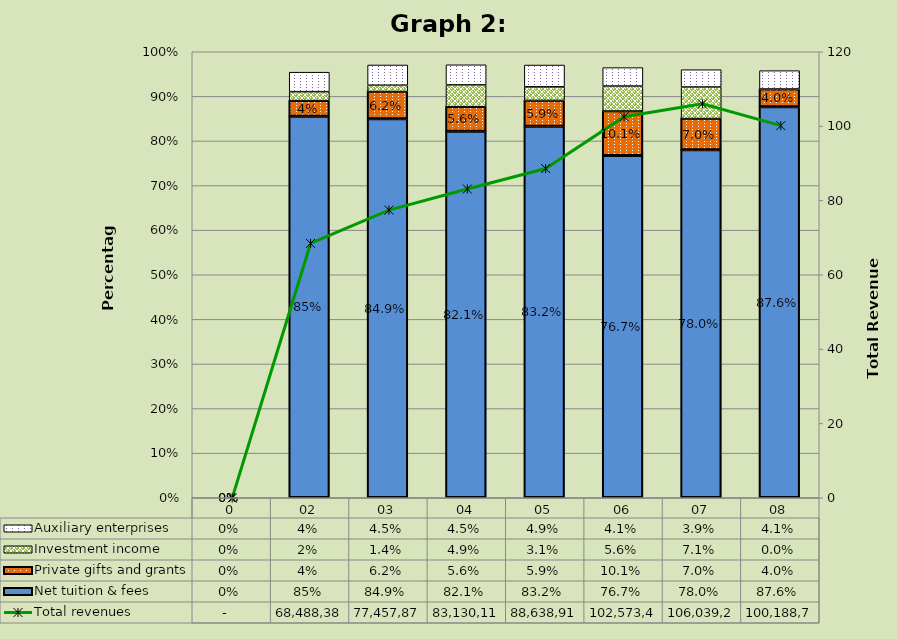
| Category | Net tuition & fees | Private gifts and grants | Investment income | Auxiliary enterprises |
|---|---|---|---|---|
| 0 | 0 | 0 | 0 | 0 |
| 02 | 0.855 | 0.036 | 0.02 | 0.044 |
| 03 | 0.849 | 0.062 | 0.014 | 0.045 |
| 04 | 0.821 | 0.056 | 0.049 | 0.045 |
| 05 | 0.832 | 0.059 | 0.031 | 0.049 |
| 06 | 0.767 | 0.101 | 0.056 | 0.041 |
| 07 | 0.78 | 0.07 | 0.071 | 0.039 |
| 08 | 0.876 | 0.04 | 0 | 0.041 |